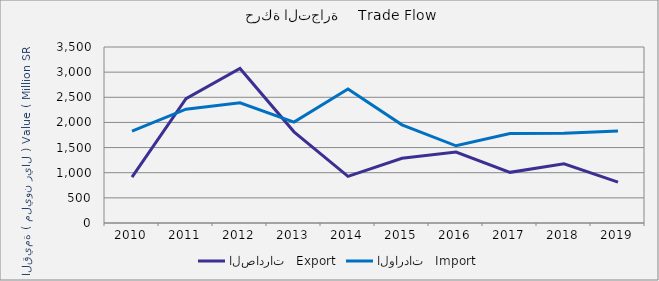
| Category | الصادرات   Export | الواردات   Import |
|---|---|---|
| 2010.0 | 910924649 | 1828920175 |
| 2011.0 | 2474210457 | 2263900879 |
| 2012.0 | 3073028009 | 2389752422 |
| 2013.0 | 1812872990 | 2006569959 |
| 2014.0 | 927654520 | 2665625467 |
| 2015.0 | 1287826403 | 1951924722 |
| 2016.0 | 1412092860 | 1535659434 |
| 2017.0 | 1007157336 | 1778252169 |
| 2018.0 | 1176259095 | 1785967125 |
| 2019.0 | 812133449 | 1831276827 |